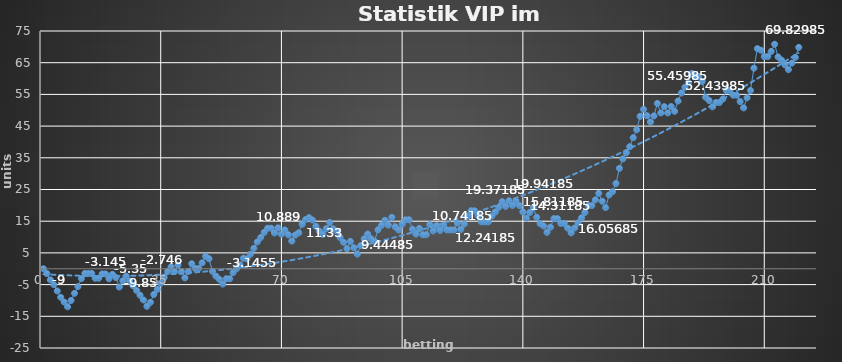
| Category | Series 0 |
|---|---|
| 0 | 0 |
| 1 | -1.5 |
| 2 | -3.5 |
| 3 | -5 |
| 4 | -7 |
| 5 | -9 |
| 6 | -10.5 |
| 7 | -12 |
| 8 | -10 |
| 9 | -7.76 |
| 10 | -5.62 |
| 11 | -3.1 |
| 12 | -1.495 |
| 13 | -1.495 |
| 14 | -1.495 |
| 15 | -2.995 |
| 16 | -2.995 |
| 17 | -1.645 |
| 18 | -1.645 |
| 19 | -3.145 |
| 20 | -1.765 |
| 21 | -2.765 |
| 22 | -5.765 |
| 23 | -3.805 |
| 24 | -2.35 |
| 25 | -3.85 |
| 26 | -5.35 |
| 27 | -6.85 |
| 28 | -8.35 |
| 29 | -9.85 |
| 30 | -11.85 |
| 31 | -10.6 |
| 32 | -8.116 |
| 33 | -6.526 |
| 34 | -4.576 |
| 35 | -2.746 |
| 36 | -0.846 |
| 37 | 0.579 |
| 38 | -0.921 |
| 39 | 1.119 |
| 40 | -0.881 |
| 41 | -2.881 |
| 42 | -0.891 |
| 43 | 1.587 |
| 44 | 0.087 |
| 45 | 0.087 |
| 46 | 1.864 |
| 47 | 3.924 |
| 48 | 3.174 |
| 49 | -0.826 |
| 50 | -2.326 |
| 51 | -3.326 |
| 52 | -4.826 |
| 53 | -3.146 |
| 54 | -3.146 |
| 55 | -1.226 |
| 56 | 0.014 |
| 57 | 1.214 |
| 58 | 3.314 |
| 59 | 3.114 |
| 60 | 4.584 |
| 61 | 6.444 |
| 62 | 8.444 |
| 63 | 9.859 |
| 64 | 11.459 |
| 65 | 12.779 |
| 66 | 12.779 |
| 67 | 11.279 |
| 68 | 12.889 |
| 69 | 10.889 |
| 70 | 12.239 |
| 71 | 10.739 |
| 72 | 8.739 |
| 73 | 10.625 |
| 74 | 11.33 |
| 75 | 14.03 |
| 76 | 15.522 |
| 77 | 16.11 |
| 78 | 15.36 |
| 79 | 13.36 |
| 80 | 11.86 |
| 81 | 10.86 |
| 82 | 12.66 |
| 83 | 14.605 |
| 84 | 12.605 |
| 85 | 11.855 |
| 86 | 9.855 |
| 87 | 8.355 |
| 88 | 6.355 |
| 89 | 8.635 |
| 90 | 6.635 |
| 91 | 4.635 |
| 92 | 7.305 |
| 93 | 9.445 |
| 94 | 10.945 |
| 95 | 9.445 |
| 96 | 8.695 |
| 97 | 12.295 |
| 98 | 13.675 |
| 99 | 15.275 |
| 100 | 13.775 |
| 101 | 16.232 |
| 102 | 13.232 |
| 103 | 12.232 |
| 104 | 14.032 |
| 105 | 15.442 |
| 106 | 15.442 |
| 107 | 12.442 |
| 108 | 10.942 |
| 109 | 12.742 |
| 110 | 10.742 |
| 111 | 10.742 |
| 112 | 13.952 |
| 113 | 11.952 |
| 114 | 13.602 |
| 115 | 12.102 |
| 116 | 13.742 |
| 117 | 12.242 |
| 118 | 12.242 |
| 119 | 12.242 |
| 120 | 14.422 |
| 121 | 12.422 |
| 122 | 14.102 |
| 123 | 16.577 |
| 124 | 18.297 |
| 125 | 18.297 |
| 126 | 16.797 |
| 127 | 14.797 |
| 128 | 14.797 |
| 129 | 14.797 |
| 130 | 16.597 |
| 131 | 17.872 |
| 132 | 19.372 |
| 133 | 21.172 |
| 134 | 19.672 |
| 135 | 21.472 |
| 136 | 19.972 |
| 137 | 21.442 |
| 138 | 19.942 |
| 139 | 17.942 |
| 140 | 15.942 |
| 141 | 17.742 |
| 142 | 19.242 |
| 143 | 16.242 |
| 144 | 14.242 |
| 145 | 13.492 |
| 146 | 11.492 |
| 147 | 13.112 |
| 148 | 15.812 |
| 149 | 15.812 |
| 150 | 14.312 |
| 151 | 14.312 |
| 152 | 12.812 |
| 153 | 11.312 |
| 154 | 12.857 |
| 155 | 14.457 |
| 156 | 16.057 |
| 157 | 17.762 |
| 158 | 19.942 |
| 159 | 19.942 |
| 160 | 21.742 |
| 161 | 23.792 |
| 162 | 21.292 |
| 163 | 19.292 |
| 164 | 23.292 |
| 165 | 24.312 |
| 166 | 26.892 |
| 167 | 31.687 |
| 168 | 34.672 |
| 169 | 36.592 |
| 170 | 38.512 |
| 171 | 41.341 |
| 172 | 43.841 |
| 173 | 48.08 |
| 174 | 50.28 |
| 175 | 48.28 |
| 176 | 46.28 |
| 177 | 48.22 |
| 178 | 52.15 |
| 179 | 49.15 |
| 180 | 51.15 |
| 181 | 49.15 |
| 182 | 51.17 |
| 183 | 49.67 |
| 184 | 52.91 |
| 185 | 55.46 |
| 186 | 57.24 |
| 187 | 58.74 |
| 188 | 61.59 |
| 189 | 60.59 |
| 190 | 60.59 |
| 191 | 59.09 |
| 192 | 54.09 |
| 193 | 53.09 |
| 194 | 51.09 |
| 195 | 52.44 |
| 196 | 52.44 |
| 197 | 53.54 |
| 198 | 56.24 |
| 199 | 56.24 |
| 200 | 54.74 |
| 201 | 54.74 |
| 202 | 52.74 |
| 203 | 50.74 |
| 204 | 53.94 |
| 205 | 56.24 |
| 206 | 63.26 |
| 207 | 69.44 |
| 208 | 68.94 |
| 209 | 66.94 |
| 210 | 66.94 |
| 211 | 68.54 |
| 212 | 70.82 |
| 213 | 66.82 |
| 214 | 65.82 |
| 215 | 64.32 |
| 216 | 62.82 |
| 217 | 64.86 |
| 218 | 66.68 |
| 219 | 69.83 |